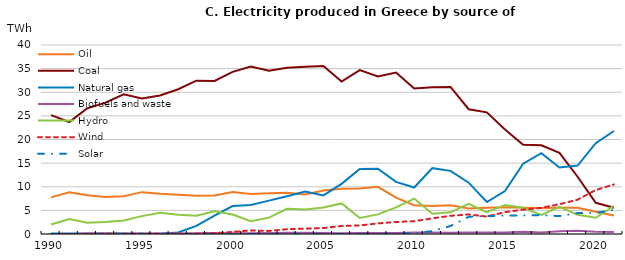
| Category | Oil | Coal | Natural gas | Biofuels and waste | Hydro | Wind | Solar |
|---|---|---|---|---|---|---|---|
| 1990.0 | 7.746 | 25.166 | 0.092 | 0 | 1.997 | 0.002 | 0 |
| 1991.0 | 8.847 | 23.702 | 0.093 | 0 | 3.171 | 0.002 | 0 |
| 1992.0 | 8.186 | 26.612 | 0.079 | 0.137 | 2.389 | 0.008 | 0 |
| 1993.0 | 7.837 | 27.795 | 0.084 | 0.092 | 2.541 | 0.047 | 0 |
| 1994.0 | 8.011 | 29.578 | 0.08 | 0.076 | 2.842 | 0.037 | 0 |
| 1995.0 | 8.86 | 28.697 | 0.075 | 0.104 | 3.782 | 0.034 | 0 |
| 1996.0 | 8.534 | 29.298 | 0.078 | 0.115 | 4.504 | 0.038 | 0 |
| 1997.0 | 8.299 | 30.629 | 0.333 | 0.113 | 4.096 | 0.036 | 0 |
| 1998.0 | 8.078 | 32.442 | 1.713 | 0.16 | 3.866 | 0.07 | 0 |
| 1999.0 | 8.157 | 32.381 | 3.907 | 0.196 | 4.829 | 0.162 | 0 |
| 2000.0 | 8.885 | 34.313 | 5.92 | 0.163 | 4.111 | 0.451 | 0 |
| 2001.0 | 8.477 | 35.431 | 6.133 | 0.182 | 2.725 | 0.756 | 0 |
| 2002.0 | 8.633 | 34.566 | 7.061 | 0.234 | 3.463 | 0.651 | 0 |
| 2003.0 | 8.707 | 35.17 | 7.995 | 0.246 | 5.332 | 1.021 | 0 |
| 2004.0 | 8.385 | 35.38 | 8.991 | 0.263 | 5.205 | 1.121 | 0.001 |
| 2005.0 | 9.207 | 35.543 | 8.171 | 0.222 | 5.61 | 1.266 | 0.001 |
| 2006.0 | 9.601 | 32.264 | 10.61 | 0.139 | 6.475 | 1.699 | 0.001 |
| 2007.0 | 9.642 | 34.676 | 13.774 | 0.209 | 3.376 | 1.818 | 0.001 |
| 2008.0 | 9.99 | 33.356 | 13.797 | 0.21 | 4.149 | 2.242 | 0.005 |
| 2009.0 | 7.679 | 34.188 | 11.023 | 0.237 | 5.621 | 2.543 | 0.05 |
| 2010.0 | 6.089 | 30.797 | 9.83 | 0.319 | 7.498 | 2.714 | 0.158 |
| 2011.0 | 5.915 | 31.063 | 13.938 | 0.32 | 4.275 | 3.315 | 0.61 |
| 2012.0 | 6.08 | 31.119 | 13.361 | 0.264 | 4.591 | 3.85 | 1.694 |
| 2013.0 | 5.414 | 26.406 | 10.86 | 0.301 | 6.384 | 4.139 | 3.648 |
| 2014.0 | 5.544 | 25.746 | 6.776 | 0.32 | 4.607 | 3.689 | 3.792 |
| 2015.0 | 5.663 | 22.107 | 9.09 | 0.343 | 6.15 | 4.621 | 3.9 |
| 2016.0 | 5.565 | 18.883 | 14.868 | 0.482 | 5.565 | 5.146 | 3.93 |
| 2017.0 | 5.51 | 18.765 | 17.113 | 0.31 | 4.04 | 5.537 | 3.991 |
| 2018.0 | 5.547 | 17.185 | 14.08 | 0.6 | 5.76 | 6.3 | 3.791 |
| 2019.0 | 5.569 | 12.124 | 14.496 | 0.692 | 4.051 | 7.266 | 4.429 |
| 2020.0 | 4.728 | 6.605 | 19.228 | 0.494 | 3.44 | 9.31 | 4.447 |
| 2021.0 | 3.936 | 5.538 | 21.807 | 0.411 | 5.967 | 10.483 | 5.106 |